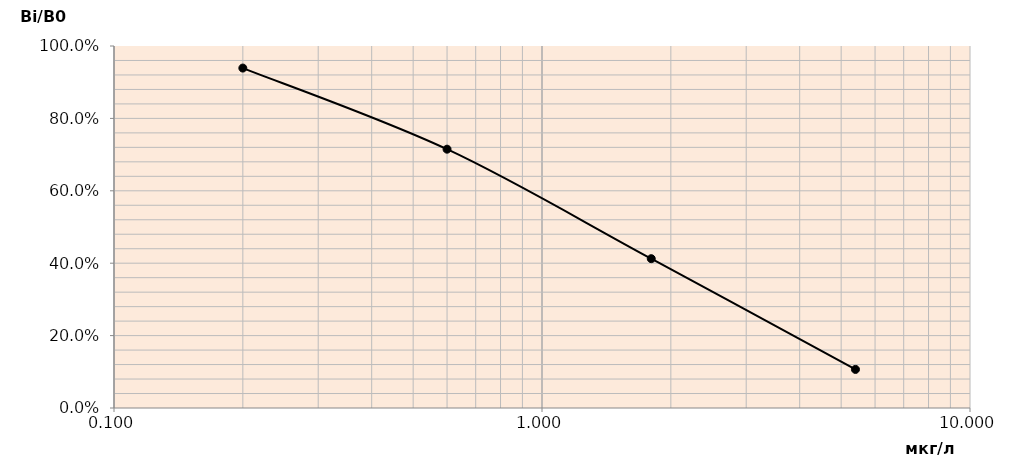
| Category | Series 0 |
|---|---|
| 0.2 | 0.939 |
| 0.6 | 0.715 |
| 1.8 | 0.412 |
| 5.4 | 0.107 |